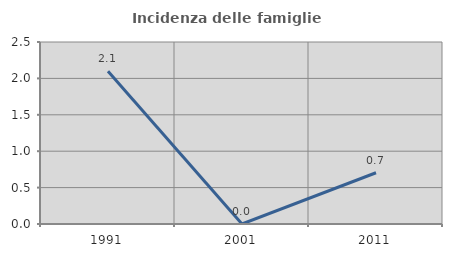
| Category | Incidenza delle famiglie numerose |
|---|---|
| 1991.0 | 2.098 |
| 2001.0 | 0 |
| 2011.0 | 0.704 |